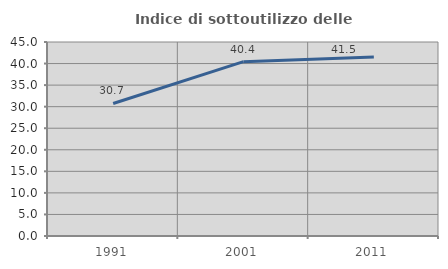
| Category | Indice di sottoutilizzo delle abitazioni  |
|---|---|
| 1991.0 | 30.742 |
| 2001.0 | 40.445 |
| 2011.0 | 41.533 |